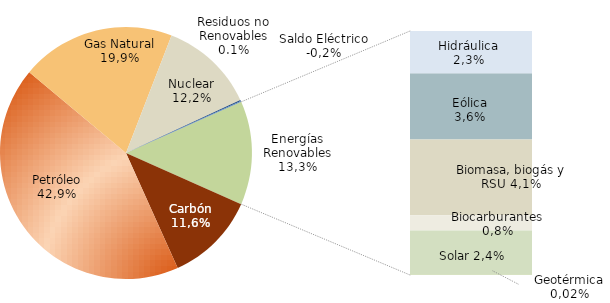
| Category | Series 0 |
|---|---|
| Carbón | 14270.734 |
| Petróleo | 52554.683 |
| Gas Natural | 24338.56 |
| Nuclear | 14989.362 |
| Residuos no Renovables | 170.028 |
| Saldo Eléctrico | -144.058 |
| Hidráulica | 2849.94 |
| Eólica | 4416.146 |
| Biomasa, biogás y RSU | 5066.848 |
| Biocarburantes | 1021.713 |
| Solar | 2964.977 |
| Geotérmica | 18.922 |